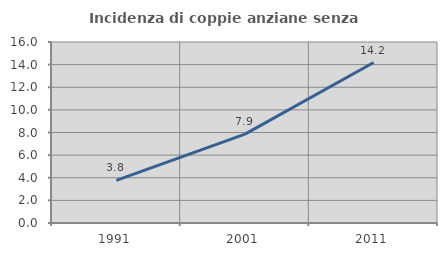
| Category | Incidenza di coppie anziane senza figli  |
|---|---|
| 1991.0 | 3.768 |
| 2001.0 | 7.854 |
| 2011.0 | 14.186 |